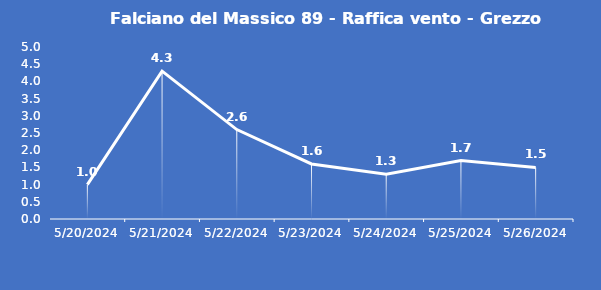
| Category | Falciano del Massico 89 - Raffica vento - Grezzo (m/s) |
|---|---|
| 5/20/24 | 1 |
| 5/21/24 | 4.3 |
| 5/22/24 | 2.6 |
| 5/23/24 | 1.6 |
| 5/24/24 | 1.3 |
| 5/25/24 | 1.7 |
| 5/26/24 | 1.5 |